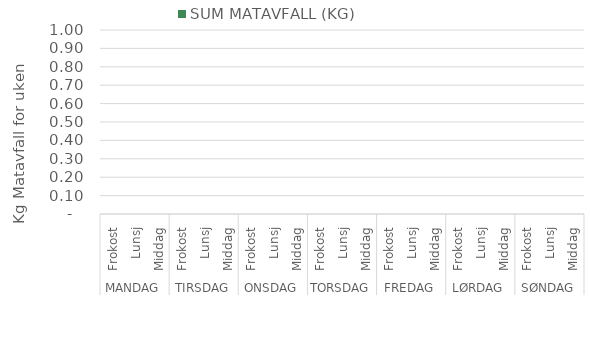
| Category |  SUM MATAVFALL (KG)  |
|---|---|
| 0 | 0 |
| 1 | 0 |
| 2 | 0 |
| 3 | 0 |
| 4 | 0 |
| 5 | 0 |
| 6 | 0 |
| 7 | 0 |
| 8 | 0 |
| 9 | 0 |
| 10 | 0 |
| 11 | 0 |
| 12 | 0 |
| 13 | 0 |
| 14 | 0 |
| 15 | 0 |
| 16 | 0 |
| 17 | 0 |
| 18 | 0 |
| 19 | 0 |
| 20 | 0 |